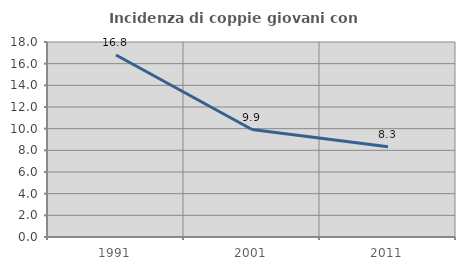
| Category | Incidenza di coppie giovani con figli |
|---|---|
| 1991.0 | 16.795 |
| 2001.0 | 9.918 |
| 2011.0 | 8.325 |